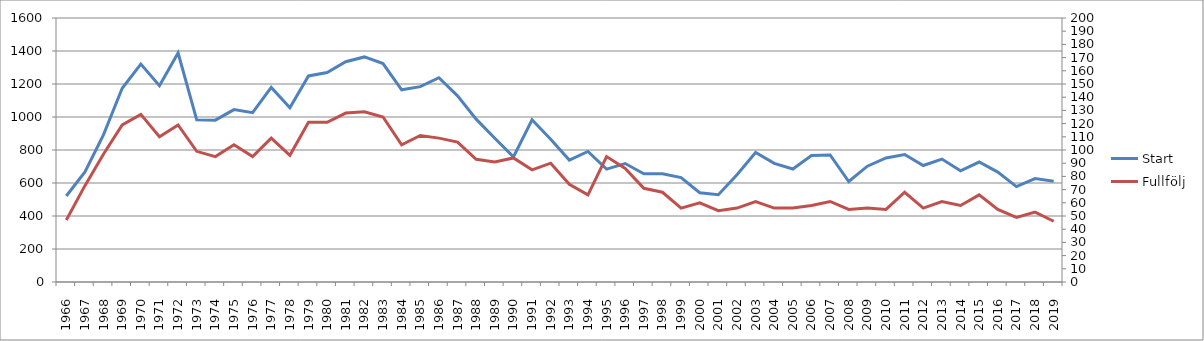
| Category | Start |
|---|---|
| 1966.0 | 521 |
| 1967.0 | 667 |
| 1968.0 | 893 |
| 1969.0 | 1174 |
| 1970.0 | 1321 |
| 1971.0 | 1190 |
| 1972.0 | 1388 |
| 1973.0 | 983 |
| 1974.0 | 981 |
| 1975.0 | 1045 |
| 1976.0 | 1026 |
| 1977.0 | 1179 |
| 1978.0 | 1056 |
| 1979.0 | 1249 |
| 1980.0 | 1270 |
| 1981.0 | 1335 |
| 1982.0 | 1364 |
| 1983.0 | 1324 |
| 1984.0 | 1165 |
| 1985.0 | 1184 |
| 1986.0 | 1238 |
| 1987.0 | 1128 |
| 1988.0 | 987 |
| 1989.0 | 871 |
| 1990.0 | 758 |
| 1991.0 | 983 |
| 1992.0 | 865 |
| 1993.0 | 739 |
| 1994.0 | 791 |
| 1995.0 | 684 |
| 1996.0 | 718 |
| 1997.0 | 656 |
| 1998.0 | 656 |
| 1999.0 | 633 |
| 2000.0 | 541 |
| 2001.0 | 529 |
| 2002.0 | 650 |
| 2003.0 | 785 |
| 2004.0 | 719 |
| 2005.0 | 685 |
| 2006.0 | 767 |
| 2007.0 | 770 |
| 2008.0 | 609 |
| 2009.0 | 702 |
| 2010.0 | 752 |
| 2011.0 | 773 |
| 2012.0 | 706 |
| 2013.0 | 745 |
| 2014.0 | 674 |
| 2015.0 | 727 |
| 2016.0 | 666 |
| 2017.0 | 578 |
| 2018.0 | 627 |
| 2019.0 | 611 |